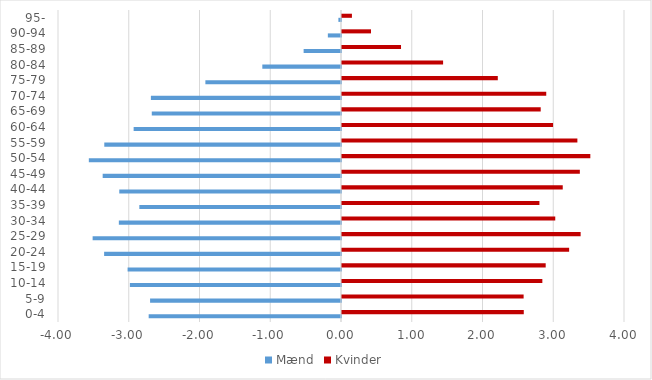
| Category | Mænd | Kvinder |
|---|---|---|
| 0-4 | -2.718 | 2.569 |
| 5-9 | -2.698 | 2.567 |
| 10-14 | -2.984 | 2.832 |
| 15-19 | -3.016 | 2.879 |
| 20-24 | -3.348 | 3.21 |
| 25-29 | -3.51 | 3.373 |
| 30-34 | -3.14 | 3.014 |
| 35-39 | -2.85 | 2.791 |
| 40-44 | -3.134 | 3.12 |
| 45-49 | -3.369 | 3.362 |
| 50-54 | -3.564 | 3.51 |
| 55-59 | -3.346 | 3.327 |
| 60-64 | -2.931 | 2.983 |
| 65-69 | -2.675 | 2.809 |
| 70-74 | -2.687 | 2.887 |
| 75-79 | -1.917 | 2.202 |
| 80-84 | -1.112 | 1.429 |
| 85-89 | -0.528 | 0.834 |
| 90-94 | -0.186 | 0.41 |
| 95- | -0.037 | 0.14 |